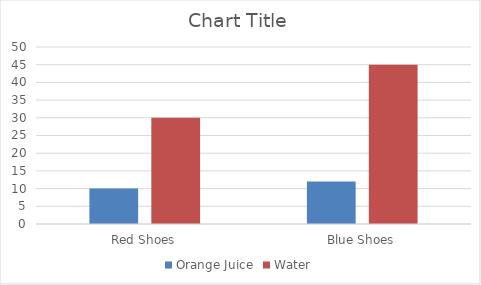
| Category | Orange Juice | Water |
|---|---|---|
| Red Shoes | 10 | 30 |
| Blue Shoes | 12 | 45 |